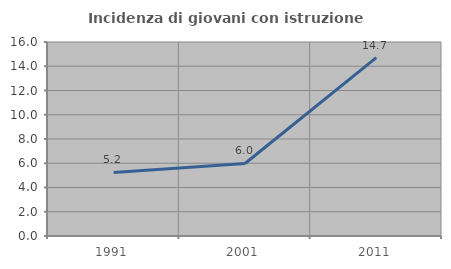
| Category | Incidenza di giovani con istruzione universitaria |
|---|---|
| 1991.0 | 5.241 |
| 2001.0 | 5.982 |
| 2011.0 | 14.714 |